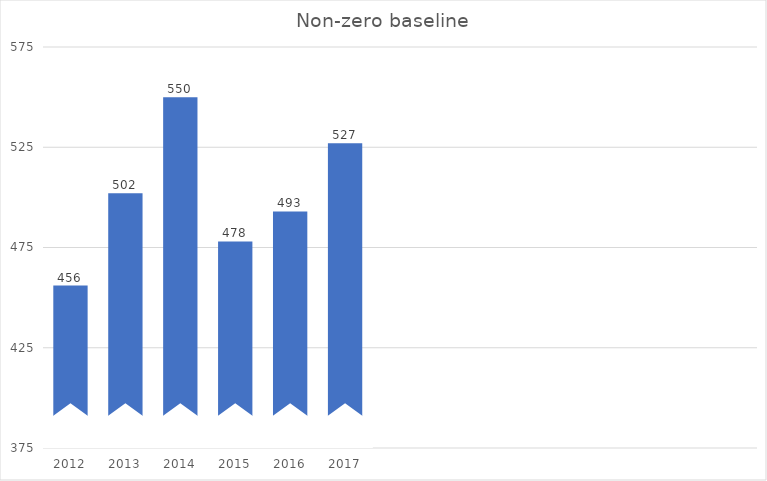
| Category | Values |
|---|---|
| 2012.0 | 456 |
| 2013.0 | 502 |
| 2014.0 | 550 |
| 2015.0 | 478 |
| 2016.0 | 493 |
| 2017.0 | 527 |